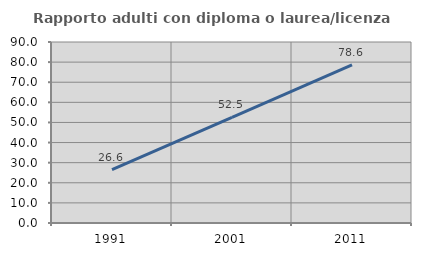
| Category | Rapporto adulti con diploma o laurea/licenza media  |
|---|---|
| 1991.0 | 26.575 |
| 2001.0 | 52.532 |
| 2011.0 | 78.621 |